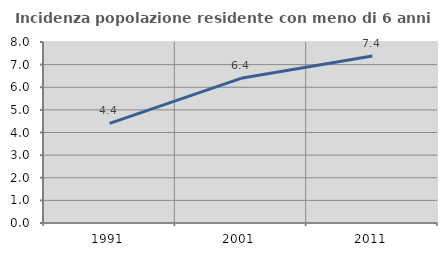
| Category | Incidenza popolazione residente con meno di 6 anni |
|---|---|
| 1991.0 | 4.404 |
| 2001.0 | 6.395 |
| 2011.0 | 7.381 |